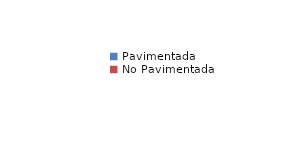
| Category | RV Vecinal |
|---|---|
| Pavimentada | 29.51 |
| No Pavimentada | 6963.228 |